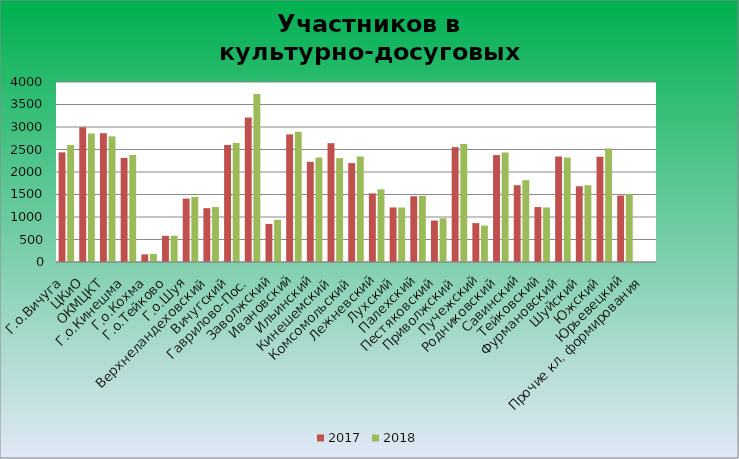
| Category | 2017 | 2018 |
|---|---|---|
| Г.о.Вичуга | 2437 | 2600 |
| ЦКиО | 2993 | 2853 |
| ОКМЦКТ | 2863 | 2793 |
| Г.о.Кинешма | 2313 | 2379 |
| Г.о.Кохма | 170 | 180 |
| Г.о.Тейково | 582 | 586 |
| Г.о.Шуя | 1409 | 1446 |
| Верхнеландеховский | 1197 | 1223 |
| Вичугский | 2601 | 2647 |
| Гаврилово-Пос. | 3212 | 3733 |
| Заволжский | 847 | 937 |
| Ивановский | 2836 | 2897 |
| Ильинский | 2226 | 2322 |
| Кинешемский | 2641 | 2308 |
| Комсомольский | 2198 | 2345 |
| Лежневский | 1524 | 1614 |
| Лухский | 1212 | 1211 |
| Палехский | 1461 | 1471 |
| Пестяковский | 922 | 971 |
| Приволжский | 2553 | 2623 |
| Пучежский | 864 | 809 |
| Родниковский | 2377 | 2435 |
| Савинский | 1706 | 1818 |
| Тейковский | 1221 | 1213 |
| Фурмановский | 2344 | 2322 |
| Шуйский | 1684 | 1706 |
| Южский | 2340 | 2523 |
| Юрьевецкий | 1477 | 1507 |
| Прочие кл. формирования | 0 | 0 |